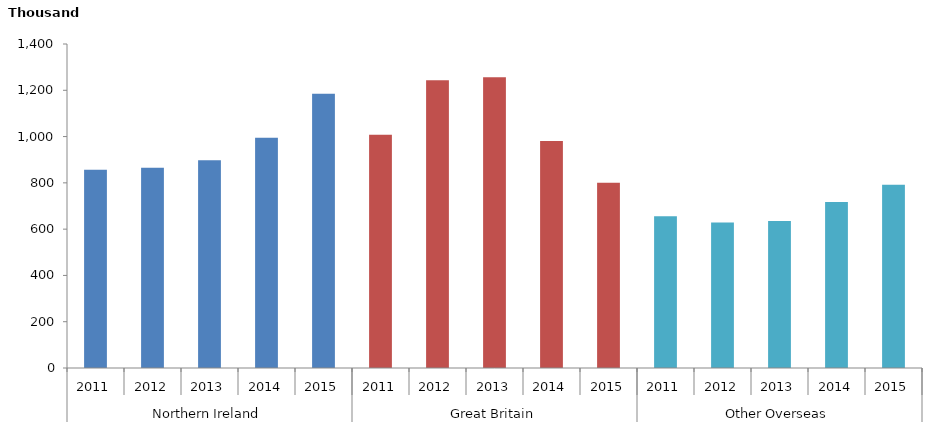
| Category | Number thousands |
|---|---|
| 0 | 857 |
| 1 | 865 |
| 2 | 898 |
| 3 | 995 |
| 4 | 1185 |
| 5 | 1008 |
| 6 | 1243 |
| 7 | 1256 |
| 8 | 981 |
| 9 | 800 |
| 10 | 656 |
| 11 | 629 |
| 12 | 635 |
| 13 | 717 |
| 14 | 792 |